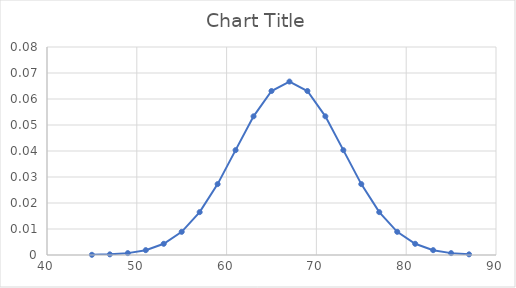
| Category | Series 0 |
|---|---|
| 45.0 | 0 |
| 47.0 | 0 |
| 49.0 | 0.001 |
| 51.0 | 0.002 |
| 53.0 | 0.004 |
| 55.0 | 0.009 |
| 57.0 | 0.016 |
| 59.0 | 0.027 |
| 61.0 | 0.04 |
| 63.0 | 0.053 |
| 65.0 | 0.063 |
| 67.0 | 0.067 |
| 69.0 | 0.063 |
| 71.0 | 0.053 |
| 73.0 | 0.04 |
| 75.0 | 0.027 |
| 77.0 | 0.016 |
| 79.0 | 0.009 |
| 81.0 | 0.004 |
| 83.0 | 0.002 |
| 85.0 | 0.001 |
| 87.0 | 0 |